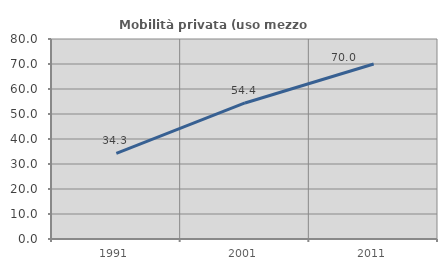
| Category | Mobilità privata (uso mezzo privato) |
|---|---|
| 1991.0 | 34.286 |
| 2001.0 | 54.412 |
| 2011.0 | 70 |